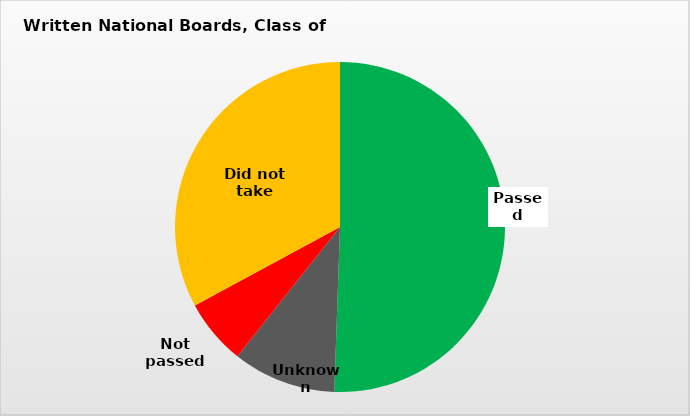
| Category | Series 0 |
|---|---|
| Passed | 0.506 |
| Unknown | 0.101 |
| Not passed | 0.064 |
| Did not take | 0.329 |